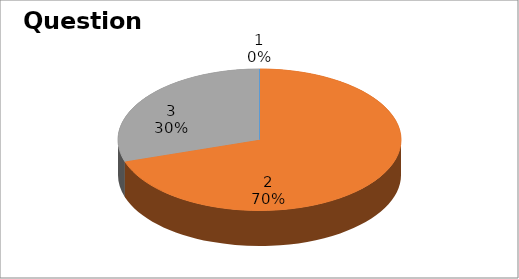
| Category | Series 0 |
|---|---|
| 0 | 0 |
| 1 | 7 |
| 2 | 3 |